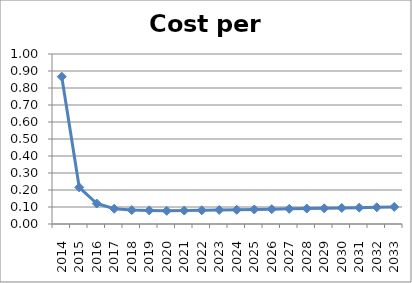
| Category | Series 0 |
|---|---|
| 2014.0 | 0.866 |
| 2015.0 | 0.215 |
| 2016.0 | 0.12 |
| 2017.0 | 0.09 |
| 2018.0 | 0.082 |
| 2019.0 | 0.08 |
| 2020.0 | 0.078 |
| 2021.0 | 0.079 |
| 2022.0 | 0.081 |
| 2023.0 | 0.082 |
| 2024.0 | 0.084 |
| 2025.0 | 0.085 |
| 2026.0 | 0.087 |
| 2027.0 | 0.089 |
| 2028.0 | 0.091 |
| 2029.0 | 0.092 |
| 2030.0 | 0.094 |
| 2031.0 | 0.096 |
| 2032.0 | 0.098 |
| 2033.0 | 0.1 |